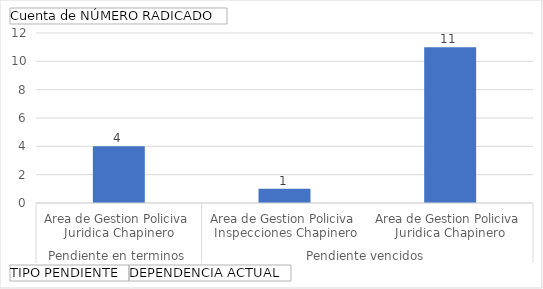
| Category | Total |
|---|---|
| 0 | 4 |
| 1 | 1 |
| 2 | 11 |